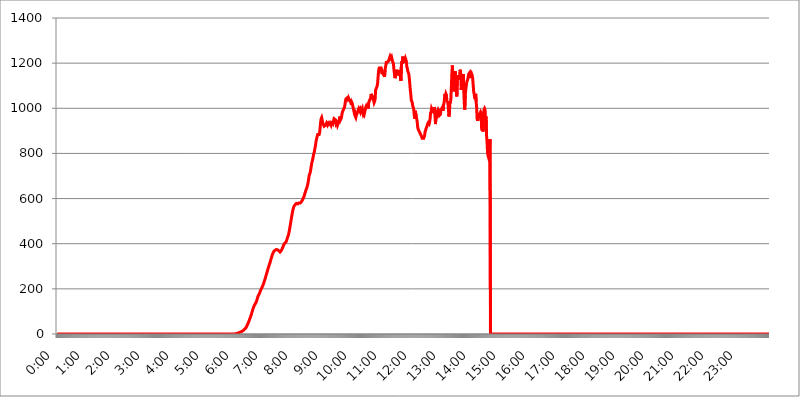
| Category | 2015.03.05. Intenzitás [W/m^2] |
|---|---|
| 0.0 | -0.256 |
| 0.0006944444444444445 | -0.256 |
| 0.001388888888888889 | -0.256 |
| 0.0020833333333333333 | -0.256 |
| 0.002777777777777778 | -0.256 |
| 0.003472222222222222 | -0.256 |
| 0.004166666666666667 | -0.256 |
| 0.004861111111111111 | -0.256 |
| 0.005555555555555556 | -0.256 |
| 0.0062499999999999995 | -0.256 |
| 0.006944444444444444 | -0.256 |
| 0.007638888888888889 | -0.256 |
| 0.008333333333333333 | -0.256 |
| 0.009027777777777779 | -0.256 |
| 0.009722222222222222 | -0.256 |
| 0.010416666666666666 | -0.256 |
| 0.011111111111111112 | -0.256 |
| 0.011805555555555555 | -0.256 |
| 0.012499999999999999 | -0.256 |
| 0.013194444444444444 | -0.256 |
| 0.013888888888888888 | -0.256 |
| 0.014583333333333332 | -0.256 |
| 0.015277777777777777 | -0.256 |
| 0.015972222222222224 | -0.256 |
| 0.016666666666666666 | -0.256 |
| 0.017361111111111112 | -0.256 |
| 0.018055555555555557 | -0.256 |
| 0.01875 | -0.256 |
| 0.019444444444444445 | -0.256 |
| 0.02013888888888889 | -0.256 |
| 0.020833333333333332 | -0.256 |
| 0.02152777777777778 | -0.256 |
| 0.022222222222222223 | -0.256 |
| 0.02291666666666667 | -0.256 |
| 0.02361111111111111 | -0.256 |
| 0.024305555555555556 | -0.256 |
| 0.024999999999999998 | -0.256 |
| 0.025694444444444447 | -0.256 |
| 0.02638888888888889 | -0.256 |
| 0.027083333333333334 | -0.256 |
| 0.027777777777777776 | -0.256 |
| 0.02847222222222222 | -0.256 |
| 0.029166666666666664 | -0.256 |
| 0.029861111111111113 | -0.256 |
| 0.030555555555555555 | -0.256 |
| 0.03125 | -0.256 |
| 0.03194444444444445 | -0.256 |
| 0.03263888888888889 | -0.256 |
| 0.03333333333333333 | -0.256 |
| 0.034027777777777775 | -0.256 |
| 0.034722222222222224 | -0.256 |
| 0.035416666666666666 | -0.256 |
| 0.036111111111111115 | -0.256 |
| 0.03680555555555556 | -0.256 |
| 0.0375 | -0.256 |
| 0.03819444444444444 | -0.256 |
| 0.03888888888888889 | -0.256 |
| 0.03958333333333333 | -0.256 |
| 0.04027777777777778 | -0.256 |
| 0.04097222222222222 | -0.256 |
| 0.041666666666666664 | -0.256 |
| 0.042361111111111106 | -0.256 |
| 0.04305555555555556 | -0.256 |
| 0.043750000000000004 | -0.256 |
| 0.044444444444444446 | -0.256 |
| 0.04513888888888889 | -0.256 |
| 0.04583333333333334 | -0.256 |
| 0.04652777777777778 | -0.256 |
| 0.04722222222222222 | -0.256 |
| 0.04791666666666666 | -0.256 |
| 0.04861111111111111 | -0.256 |
| 0.049305555555555554 | -0.256 |
| 0.049999999999999996 | -0.256 |
| 0.05069444444444445 | -0.256 |
| 0.051388888888888894 | -0.256 |
| 0.052083333333333336 | -0.256 |
| 0.05277777777777778 | -0.256 |
| 0.05347222222222222 | -0.256 |
| 0.05416666666666667 | -0.256 |
| 0.05486111111111111 | -0.256 |
| 0.05555555555555555 | -0.256 |
| 0.05625 | -0.256 |
| 0.05694444444444444 | -0.256 |
| 0.057638888888888885 | -0.256 |
| 0.05833333333333333 | -0.256 |
| 0.05902777777777778 | -0.256 |
| 0.059722222222222225 | -0.256 |
| 0.06041666666666667 | -0.256 |
| 0.061111111111111116 | -0.256 |
| 0.06180555555555556 | -0.256 |
| 0.0625 | -0.256 |
| 0.06319444444444444 | -0.256 |
| 0.06388888888888888 | -0.256 |
| 0.06458333333333334 | -0.256 |
| 0.06527777777777778 | -0.256 |
| 0.06597222222222222 | -0.256 |
| 0.06666666666666667 | -0.256 |
| 0.06736111111111111 | -0.256 |
| 0.06805555555555555 | -0.256 |
| 0.06874999999999999 | -0.256 |
| 0.06944444444444443 | -0.256 |
| 0.07013888888888889 | -0.256 |
| 0.07083333333333333 | -0.256 |
| 0.07152777777777779 | -0.256 |
| 0.07222222222222223 | -0.256 |
| 0.07291666666666667 | -0.256 |
| 0.07361111111111111 | -0.256 |
| 0.07430555555555556 | -0.256 |
| 0.075 | -0.256 |
| 0.07569444444444444 | -0.256 |
| 0.0763888888888889 | -0.256 |
| 0.07708333333333334 | -0.256 |
| 0.07777777777777778 | -0.256 |
| 0.07847222222222222 | -0.256 |
| 0.07916666666666666 | -0.256 |
| 0.0798611111111111 | -0.256 |
| 0.08055555555555556 | -0.256 |
| 0.08125 | -0.256 |
| 0.08194444444444444 | -0.256 |
| 0.08263888888888889 | -0.256 |
| 0.08333333333333333 | -0.256 |
| 0.08402777777777777 | -0.256 |
| 0.08472222222222221 | -0.256 |
| 0.08541666666666665 | -0.256 |
| 0.08611111111111112 | -0.256 |
| 0.08680555555555557 | -0.256 |
| 0.08750000000000001 | -0.256 |
| 0.08819444444444445 | -0.256 |
| 0.08888888888888889 | -0.256 |
| 0.08958333333333333 | -0.256 |
| 0.09027777777777778 | -0.256 |
| 0.09097222222222222 | -0.256 |
| 0.09166666666666667 | -0.256 |
| 0.09236111111111112 | -0.256 |
| 0.09305555555555556 | -0.256 |
| 0.09375 | -0.256 |
| 0.09444444444444444 | -0.256 |
| 0.09513888888888888 | -0.256 |
| 0.09583333333333333 | -0.256 |
| 0.09652777777777777 | -0.256 |
| 0.09722222222222222 | -0.256 |
| 0.09791666666666667 | -0.256 |
| 0.09861111111111111 | -0.256 |
| 0.09930555555555555 | -0.256 |
| 0.09999999999999999 | -0.256 |
| 0.10069444444444443 | -0.256 |
| 0.1013888888888889 | -0.256 |
| 0.10208333333333335 | -0.256 |
| 0.10277777777777779 | -0.256 |
| 0.10347222222222223 | -0.256 |
| 0.10416666666666667 | -0.256 |
| 0.10486111111111111 | -0.256 |
| 0.10555555555555556 | -0.256 |
| 0.10625 | -0.256 |
| 0.10694444444444444 | -0.256 |
| 0.1076388888888889 | -0.256 |
| 0.10833333333333334 | -0.256 |
| 0.10902777777777778 | -0.256 |
| 0.10972222222222222 | -0.256 |
| 0.1111111111111111 | -0.256 |
| 0.11180555555555556 | -0.256 |
| 0.11180555555555556 | -0.256 |
| 0.1125 | -0.256 |
| 0.11319444444444444 | -0.256 |
| 0.11388888888888889 | -0.256 |
| 0.11458333333333333 | -0.256 |
| 0.11527777777777777 | -0.256 |
| 0.11597222222222221 | -0.256 |
| 0.11666666666666665 | -0.256 |
| 0.1173611111111111 | -0.256 |
| 0.11805555555555557 | -0.256 |
| 0.11944444444444445 | -0.256 |
| 0.12013888888888889 | -0.256 |
| 0.12083333333333333 | -0.256 |
| 0.12152777777777778 | -0.256 |
| 0.12222222222222223 | -0.256 |
| 0.12291666666666667 | -0.256 |
| 0.12291666666666667 | -0.256 |
| 0.12361111111111112 | -0.256 |
| 0.12430555555555556 | -0.256 |
| 0.125 | -0.256 |
| 0.12569444444444444 | -0.256 |
| 0.12638888888888888 | -0.256 |
| 0.12708333333333333 | -0.256 |
| 0.16875 | -0.256 |
| 0.12847222222222224 | -0.256 |
| 0.12916666666666668 | -0.256 |
| 0.12986111111111112 | -0.256 |
| 0.13055555555555556 | -0.256 |
| 0.13125 | -0.256 |
| 0.13194444444444445 | -0.256 |
| 0.1326388888888889 | -0.256 |
| 0.13333333333333333 | -0.256 |
| 0.13402777777777777 | -0.256 |
| 0.13402777777777777 | -0.256 |
| 0.13472222222222222 | -0.256 |
| 0.13541666666666666 | -0.256 |
| 0.1361111111111111 | -0.256 |
| 0.13749999999999998 | -0.256 |
| 0.13819444444444443 | -0.256 |
| 0.1388888888888889 | -0.256 |
| 0.13958333333333334 | -0.256 |
| 0.14027777777777778 | -0.256 |
| 0.14097222222222222 | -0.256 |
| 0.14166666666666666 | -0.256 |
| 0.1423611111111111 | -0.256 |
| 0.14305555555555557 | -0.256 |
| 0.14375000000000002 | -0.256 |
| 0.14444444444444446 | -0.256 |
| 0.1451388888888889 | -0.256 |
| 0.1451388888888889 | -0.256 |
| 0.14652777777777778 | -0.256 |
| 0.14722222222222223 | -0.256 |
| 0.14791666666666667 | -0.256 |
| 0.1486111111111111 | -0.256 |
| 0.14930555555555555 | -0.256 |
| 0.15 | -0.256 |
| 0.15069444444444444 | -0.256 |
| 0.15138888888888888 | -0.256 |
| 0.15208333333333332 | -0.256 |
| 0.15277777777777776 | -0.256 |
| 0.15347222222222223 | -0.256 |
| 0.15416666666666667 | -0.256 |
| 0.15486111111111112 | -0.256 |
| 0.15555555555555556 | -0.256 |
| 0.15625 | -0.256 |
| 0.15694444444444444 | -0.256 |
| 0.15763888888888888 | -0.256 |
| 0.15833333333333333 | -0.256 |
| 0.15902777777777777 | -0.256 |
| 0.15972222222222224 | -0.256 |
| 0.16041666666666668 | -0.256 |
| 0.16111111111111112 | -0.256 |
| 0.16180555555555556 | -0.256 |
| 0.1625 | -0.256 |
| 0.16319444444444445 | -0.256 |
| 0.1638888888888889 | -0.256 |
| 0.16458333333333333 | -0.256 |
| 0.16527777777777777 | -0.256 |
| 0.16597222222222222 | -0.256 |
| 0.16666666666666666 | -0.256 |
| 0.1673611111111111 | -0.256 |
| 0.16805555555555554 | -0.256 |
| 0.16874999999999998 | -0.256 |
| 0.16944444444444443 | -0.256 |
| 0.17013888888888887 | -0.256 |
| 0.1708333333333333 | -0.256 |
| 0.17152777777777775 | -0.256 |
| 0.17222222222222225 | -0.256 |
| 0.1729166666666667 | -0.256 |
| 0.17361111111111113 | -0.256 |
| 0.17430555555555557 | -0.256 |
| 0.17500000000000002 | -0.256 |
| 0.17569444444444446 | -0.256 |
| 0.1763888888888889 | -0.256 |
| 0.17708333333333334 | -0.256 |
| 0.17777777777777778 | -0.256 |
| 0.17847222222222223 | -0.256 |
| 0.17916666666666667 | -0.256 |
| 0.1798611111111111 | -0.256 |
| 0.18055555555555555 | -0.256 |
| 0.18125 | -0.256 |
| 0.18194444444444444 | -0.256 |
| 0.1826388888888889 | -0.256 |
| 0.18333333333333335 | -0.256 |
| 0.1840277777777778 | -0.256 |
| 0.18472222222222223 | -0.256 |
| 0.18541666666666667 | -0.256 |
| 0.18611111111111112 | -0.256 |
| 0.18680555555555556 | -0.256 |
| 0.1875 | -0.256 |
| 0.18819444444444444 | -0.256 |
| 0.18888888888888888 | -0.256 |
| 0.18958333333333333 | -0.256 |
| 0.19027777777777777 | -0.256 |
| 0.1909722222222222 | -0.256 |
| 0.19166666666666665 | -0.256 |
| 0.19236111111111112 | -0.256 |
| 0.19305555555555554 | -0.256 |
| 0.19375 | -0.256 |
| 0.19444444444444445 | -0.256 |
| 0.1951388888888889 | -0.256 |
| 0.19583333333333333 | -0.256 |
| 0.19652777777777777 | -0.256 |
| 0.19722222222222222 | -0.256 |
| 0.19791666666666666 | -0.256 |
| 0.1986111111111111 | -0.256 |
| 0.19930555555555554 | -0.256 |
| 0.19999999999999998 | -0.256 |
| 0.20069444444444443 | -0.256 |
| 0.20138888888888887 | -0.256 |
| 0.2020833333333333 | -0.256 |
| 0.2027777777777778 | -0.256 |
| 0.2034722222222222 | -0.256 |
| 0.2041666666666667 | -0.256 |
| 0.20486111111111113 | -0.256 |
| 0.20555555555555557 | -0.256 |
| 0.20625000000000002 | -0.256 |
| 0.20694444444444446 | -0.256 |
| 0.2076388888888889 | -0.256 |
| 0.20833333333333334 | -0.256 |
| 0.20902777777777778 | -0.256 |
| 0.20972222222222223 | -0.256 |
| 0.21041666666666667 | -0.256 |
| 0.2111111111111111 | -0.256 |
| 0.21180555555555555 | -0.256 |
| 0.2125 | -0.256 |
| 0.21319444444444444 | -0.256 |
| 0.2138888888888889 | -0.256 |
| 0.21458333333333335 | -0.256 |
| 0.2152777777777778 | -0.256 |
| 0.21597222222222223 | -0.256 |
| 0.21666666666666667 | -0.256 |
| 0.21736111111111112 | -0.256 |
| 0.21805555555555556 | -0.256 |
| 0.21875 | -0.256 |
| 0.21944444444444444 | -0.256 |
| 0.22013888888888888 | -0.256 |
| 0.22083333333333333 | -0.256 |
| 0.22152777777777777 | -0.256 |
| 0.2222222222222222 | -0.256 |
| 0.22291666666666665 | -0.256 |
| 0.2236111111111111 | -0.256 |
| 0.22430555555555556 | -0.256 |
| 0.225 | -0.256 |
| 0.22569444444444445 | -0.256 |
| 0.2263888888888889 | -0.256 |
| 0.22708333333333333 | -0.256 |
| 0.22777777777777777 | -0.256 |
| 0.22847222222222222 | -0.256 |
| 0.22916666666666666 | -0.256 |
| 0.2298611111111111 | -0.256 |
| 0.23055555555555554 | -0.256 |
| 0.23124999999999998 | -0.256 |
| 0.23194444444444443 | -0.256 |
| 0.23263888888888887 | -0.256 |
| 0.2333333333333333 | -0.256 |
| 0.2340277777777778 | -0.256 |
| 0.2347222222222222 | -0.256 |
| 0.2354166666666667 | -0.256 |
| 0.23611111111111113 | -0.256 |
| 0.23680555555555557 | -0.256 |
| 0.23750000000000002 | -0.256 |
| 0.23819444444444446 | -0.256 |
| 0.2388888888888889 | -0.256 |
| 0.23958333333333334 | -0.256 |
| 0.24027777777777778 | -0.256 |
| 0.24097222222222223 | -0.256 |
| 0.24166666666666667 | -0.256 |
| 0.2423611111111111 | -0.256 |
| 0.24305555555555555 | -0.256 |
| 0.24375 | -0.256 |
| 0.24444444444444446 | -0.256 |
| 0.24513888888888888 | -0.256 |
| 0.24583333333333335 | -0.256 |
| 0.2465277777777778 | -0.256 |
| 0.24722222222222223 | -0.256 |
| 0.24791666666666667 | -0.256 |
| 0.24861111111111112 | -0.256 |
| 0.24930555555555556 | 1.09 |
| 0.25 | 1.09 |
| 0.25069444444444444 | 1.09 |
| 0.2513888888888889 | 2.439 |
| 0.2520833333333333 | 2.439 |
| 0.25277777777777777 | 3.791 |
| 0.2534722222222222 | 3.791 |
| 0.25416666666666665 | 5.146 |
| 0.2548611111111111 | 5.146 |
| 0.2555555555555556 | 6.503 |
| 0.25625000000000003 | 7.862 |
| 0.2569444444444445 | 9.225 |
| 0.2576388888888889 | 9.225 |
| 0.25833333333333336 | 10.589 |
| 0.2590277777777778 | 11.956 |
| 0.25972222222222224 | 13.325 |
| 0.2604166666666667 | 14.696 |
| 0.2611111111111111 | 16.069 |
| 0.26180555555555557 | 18.822 |
| 0.2625 | 20.201 |
| 0.26319444444444445 | 21.582 |
| 0.2638888888888889 | 22.965 |
| 0.26458333333333334 | 27.124 |
| 0.2652777777777778 | 31.297 |
| 0.2659722222222222 | 35.483 |
| 0.26666666666666666 | 39.68 |
| 0.2673611111111111 | 45.29 |
| 0.26805555555555555 | 50.914 |
| 0.26875 | 56.548 |
| 0.26944444444444443 | 62.189 |
| 0.2701388888888889 | 67.835 |
| 0.2708333333333333 | 73.481 |
| 0.27152777777777776 | 80.536 |
| 0.2722222222222222 | 86.175 |
| 0.27291666666666664 | 94.617 |
| 0.2736111111111111 | 101.634 |
| 0.2743055555555555 | 108.629 |
| 0.27499999999999997 | 115.598 |
| 0.27569444444444446 | 121.152 |
| 0.27638888888888885 | 125.304 |
| 0.27708333333333335 | 130.821 |
| 0.2777777777777778 | 133.57 |
| 0.27847222222222223 | 137.683 |
| 0.2791666666666667 | 141.782 |
| 0.2798611111111111 | 148.579 |
| 0.28055555555555556 | 156.678 |
| 0.28125 | 163.378 |
| 0.28194444444444444 | 170.029 |
| 0.2826388888888889 | 173.996 |
| 0.2833333333333333 | 177.946 |
| 0.28402777777777777 | 183.184 |
| 0.2847222222222222 | 189.685 |
| 0.28541666666666665 | 194.849 |
| 0.28611111111111115 | 198.701 |
| 0.28680555555555554 | 203.807 |
| 0.28750000000000003 | 208.881 |
| 0.2881944444444445 | 213.921 |
| 0.2888888888888889 | 218.93 |
| 0.28958333333333336 | 225.146 |
| 0.2902777777777778 | 232.54 |
| 0.29097222222222224 | 238.651 |
| 0.2916666666666667 | 245.925 |
| 0.2923611111111111 | 253.137 |
| 0.29305555555555557 | 261.48 |
| 0.29375 | 268.576 |
| 0.29444444444444445 | 275.626 |
| 0.2951388888888889 | 283.803 |
| 0.29583333333333334 | 290.777 |
| 0.2965277777777778 | 297.728 |
| 0.2972222222222222 | 304.664 |
| 0.29791666666666666 | 311.594 |
| 0.2986111111111111 | 318.527 |
| 0.29930555555555555 | 326.633 |
| 0.3 | 333.608 |
| 0.30069444444444443 | 340.62 |
| 0.3013888888888889 | 348.865 |
| 0.3020833333333333 | 354.805 |
| 0.30277777777777776 | 359.595 |
| 0.3034722222222222 | 364.422 |
| 0.30416666666666664 | 366.851 |
| 0.3048611111111111 | 369.291 |
| 0.3055555555555555 | 371.742 |
| 0.30624999999999997 | 372.972 |
| 0.3069444444444444 | 374.206 |
| 0.3076388888888889 | 374.206 |
| 0.30833333333333335 | 374.206 |
| 0.3090277777777778 | 372.972 |
| 0.30972222222222223 | 371.742 |
| 0.3104166666666667 | 370.515 |
| 0.3111111111111111 | 368.07 |
| 0.31180555555555556 | 364.422 |
| 0.3125 | 363.212 |
| 0.31319444444444444 | 364.422 |
| 0.3138888888888889 | 368.07 |
| 0.3145833333333333 | 371.742 |
| 0.31527777777777777 | 376.682 |
| 0.3159722222222222 | 381.674 |
| 0.31666666666666665 | 386.723 |
| 0.31736111111111115 | 393.122 |
| 0.31805555555555554 | 397.012 |
| 0.31875000000000003 | 400.943 |
| 0.3194444444444445 | 402.262 |
| 0.3201388888888889 | 404.916 |
| 0.32083333333333336 | 407.589 |
| 0.3215277777777778 | 412.998 |
| 0.32222222222222224 | 419.883 |
| 0.3229166666666667 | 426.916 |
| 0.3236111111111111 | 432.656 |
| 0.32430555555555557 | 439.982 |
| 0.325 | 449.011 |
| 0.32569444444444445 | 461.486 |
| 0.3263888888888889 | 474.507 |
| 0.32708333333333334 | 486.389 |
| 0.3277777777777778 | 500.575 |
| 0.3284722222222222 | 513.561 |
| 0.32916666666666666 | 527.122 |
| 0.3298611111111111 | 539.234 |
| 0.33055555555555555 | 549.691 |
| 0.33125 | 558.305 |
| 0.33194444444444443 | 564.917 |
| 0.3326388888888889 | 569.398 |
| 0.3333333333333333 | 571.661 |
| 0.3340277777777778 | 573.939 |
| 0.3347222222222222 | 576.233 |
| 0.3354166666666667 | 578.542 |
| 0.3361111111111111 | 580.866 |
| 0.3368055555555556 | 580.866 |
| 0.33749999999999997 | 576.233 |
| 0.33819444444444446 | 576.233 |
| 0.33888888888888885 | 580.866 |
| 0.33958333333333335 | 578.542 |
| 0.34027777777777773 | 578.542 |
| 0.34097222222222223 | 580.866 |
| 0.3416666666666666 | 580.866 |
| 0.3423611111111111 | 585.562 |
| 0.3430555555555555 | 587.934 |
| 0.34375 | 592.725 |
| 0.3444444444444445 | 597.582 |
| 0.3451388888888889 | 602.505 |
| 0.3458333333333334 | 607.495 |
| 0.34652777777777777 | 612.554 |
| 0.34722222222222227 | 622.881 |
| 0.34791666666666665 | 628.152 |
| 0.34861111111111115 | 636.194 |
| 0.34930555555555554 | 641.649 |
| 0.35000000000000003 | 647.179 |
| 0.3506944444444444 | 655.618 |
| 0.3513888888888889 | 664.234 |
| 0.3520833333333333 | 676.003 |
| 0.3527777777777778 | 691.18 |
| 0.3534722222222222 | 703.704 |
| 0.3541666666666667 | 710.098 |
| 0.3548611111111111 | 716.58 |
| 0.35555555555555557 | 729.817 |
| 0.35625 | 743.425 |
| 0.35694444444444445 | 757.414 |
| 0.3576388888888889 | 764.555 |
| 0.35833333333333334 | 775.451 |
| 0.3590277777777778 | 786.575 |
| 0.3597222222222222 | 797.931 |
| 0.36041666666666666 | 805.632 |
| 0.3611111111111111 | 817.382 |
| 0.36180555555555555 | 829.377 |
| 0.3625 | 841.619 |
| 0.36319444444444443 | 858.335 |
| 0.3638888888888889 | 866.865 |
| 0.3645833333333333 | 875.511 |
| 0.3652777777777778 | 884.274 |
| 0.3659722222222222 | 884.274 |
| 0.3666666666666667 | 884.274 |
| 0.3673611111111111 | 884.274 |
| 0.3680555555555556 | 893.157 |
| 0.36874999999999997 | 915.893 |
| 0.36944444444444446 | 939.404 |
| 0.37013888888888885 | 953.892 |
| 0.37083333333333335 | 958.785 |
| 0.37152777777777773 | 958.785 |
| 0.37222222222222223 | 939.404 |
| 0.3729166666666666 | 929.905 |
| 0.3736111111111111 | 929.905 |
| 0.3743055555555555 | 920.533 |
| 0.375 | 920.533 |
| 0.3756944444444445 | 920.533 |
| 0.3763888888888889 | 925.203 |
| 0.3770833333333334 | 925.203 |
| 0.37777777777777777 | 934.639 |
| 0.37847222222222227 | 929.905 |
| 0.37916666666666665 | 925.203 |
| 0.37986111111111115 | 925.203 |
| 0.38055555555555554 | 934.639 |
| 0.38125000000000003 | 934.639 |
| 0.3819444444444444 | 929.905 |
| 0.3826388888888889 | 934.639 |
| 0.3833333333333333 | 929.905 |
| 0.3840277777777778 | 925.203 |
| 0.3847222222222222 | 934.639 |
| 0.3854166666666667 | 934.639 |
| 0.3861111111111111 | 939.404 |
| 0.38680555555555557 | 934.639 |
| 0.3875 | 944.201 |
| 0.38819444444444445 | 953.892 |
| 0.3888888888888889 | 953.892 |
| 0.38958333333333334 | 953.892 |
| 0.3902777777777778 | 949.03 |
| 0.3909722222222222 | 934.639 |
| 0.39166666666666666 | 939.404 |
| 0.3923611111111111 | 934.639 |
| 0.39305555555555555 | 925.203 |
| 0.39375 | 925.203 |
| 0.39444444444444443 | 925.203 |
| 0.3951388888888889 | 944.201 |
| 0.3958333333333333 | 953.892 |
| 0.3965277777777778 | 963.712 |
| 0.3972222222222222 | 949.03 |
| 0.3979166666666667 | 953.892 |
| 0.3986111111111111 | 958.785 |
| 0.3993055555555556 | 973.663 |
| 0.39999999999999997 | 983.747 |
| 0.40069444444444446 | 988.839 |
| 0.40138888888888885 | 993.965 |
| 0.40208333333333335 | 999.125 |
| 0.40277777777777773 | 1004.318 |
| 0.40347222222222223 | 1014.809 |
| 0.4041666666666666 | 1030.804 |
| 0.4048611111111111 | 1041.644 |
| 0.4055555555555555 | 1041.644 |
| 0.40625 | 1041.644 |
| 0.4069444444444445 | 1047.117 |
| 0.4076388888888889 | 1041.644 |
| 0.4083333333333334 | 1047.117 |
| 0.40902777777777777 | 1041.644 |
| 0.40972222222222227 | 1041.644 |
| 0.41041666666666665 | 1041.644 |
| 0.41111111111111115 | 1030.804 |
| 0.41180555555555554 | 1025.437 |
| 0.41250000000000003 | 1014.809 |
| 0.4131944444444444 | 1025.437 |
| 0.4138888888888889 | 1020.106 |
| 0.4145833333333333 | 1009.546 |
| 0.4152777777777778 | 999.125 |
| 0.4159722222222222 | 988.839 |
| 0.4166666666666667 | 993.965 |
| 0.4173611111111111 | 973.663 |
| 0.41805555555555557 | 963.712 |
| 0.41875 | 958.785 |
| 0.41944444444444445 | 968.671 |
| 0.4201388888888889 | 973.663 |
| 0.42083333333333334 | 973.663 |
| 0.4215277777777778 | 973.663 |
| 0.4222222222222222 | 993.965 |
| 0.42291666666666666 | 999.125 |
| 0.4236111111111111 | 999.125 |
| 0.42430555555555555 | 988.839 |
| 0.425 | 983.747 |
| 0.42569444444444443 | 993.965 |
| 0.4263888888888889 | 988.839 |
| 0.4270833333333333 | 988.839 |
| 0.4277777777777778 | 999.125 |
| 0.4284722222222222 | 983.747 |
| 0.4291666666666667 | 973.663 |
| 0.4298611111111111 | 978.688 |
| 0.4305555555555556 | 973.663 |
| 0.43124999999999997 | 973.663 |
| 0.43194444444444446 | 993.965 |
| 0.43263888888888885 | 1004.318 |
| 0.43333333333333335 | 1009.546 |
| 0.43402777777777773 | 1004.318 |
| 0.43472222222222223 | 1004.318 |
| 0.4354166666666666 | 1009.546 |
| 0.4361111111111111 | 999.125 |
| 0.4368055555555555 | 1025.437 |
| 0.4375 | 1025.437 |
| 0.4381944444444445 | 1025.437 |
| 0.4388888888888889 | 1041.644 |
| 0.4395833333333334 | 1047.117 |
| 0.44027777777777777 | 1063.751 |
| 0.44097222222222227 | 1063.751 |
| 0.44166666666666665 | 1052.625 |
| 0.44236111111111115 | 1041.644 |
| 0.44305555555555554 | 1041.644 |
| 0.44375000000000003 | 1036.206 |
| 0.4444444444444444 | 1025.437 |
| 0.4451388888888889 | 1030.804 |
| 0.4458333333333333 | 1041.644 |
| 0.4465277777777778 | 1080.711 |
| 0.4472222222222222 | 1086.439 |
| 0.4479166666666667 | 1092.203 |
| 0.4486111111111111 | 1098.004 |
| 0.44930555555555557 | 1109.72 |
| 0.45 | 1139.675 |
| 0.45069444444444445 | 1164.337 |
| 0.4513888888888889 | 1176.905 |
| 0.45208333333333334 | 1183.249 |
| 0.4527777777777778 | 1170.601 |
| 0.4534722222222222 | 1183.249 |
| 0.45416666666666666 | 1176.905 |
| 0.4548611111111111 | 1164.337 |
| 0.45555555555555555 | 1151.928 |
| 0.45625 | 1158.113 |
| 0.45694444444444443 | 1151.928 |
| 0.4576388888888889 | 1151.928 |
| 0.4583333333333333 | 1145.782 |
| 0.4590277777777778 | 1139.675 |
| 0.4597222222222222 | 1170.601 |
| 0.4604166666666667 | 1183.249 |
| 0.4611111111111111 | 1196.058 |
| 0.4618055555555556 | 1209.029 |
| 0.46249999999999997 | 1202.523 |
| 0.46319444444444446 | 1202.523 |
| 0.46388888888888885 | 1202.523 |
| 0.46458333333333335 | 1209.029 |
| 0.46527777777777773 | 1215.576 |
| 0.46597222222222223 | 1222.164 |
| 0.4666666666666666 | 1228.794 |
| 0.4673611111111111 | 1222.164 |
| 0.4680555555555555 | 1222.164 |
| 0.46875 | 1228.794 |
| 0.4694444444444445 | 1228.794 |
| 0.4701388888888889 | 1209.029 |
| 0.4708333333333334 | 1202.523 |
| 0.47152777777777777 | 1196.058 |
| 0.47222222222222227 | 1170.601 |
| 0.47291666666666665 | 1151.928 |
| 0.47361111111111115 | 1133.607 |
| 0.47430555555555554 | 1139.675 |
| 0.47500000000000003 | 1158.113 |
| 0.4756944444444444 | 1170.601 |
| 0.4763888888888889 | 1158.113 |
| 0.4770833333333333 | 1145.782 |
| 0.4777777777777778 | 1164.337 |
| 0.4784722222222222 | 1164.337 |
| 0.4791666666666667 | 1164.337 |
| 0.4798611111111111 | 1164.337 |
| 0.48055555555555557 | 1151.928 |
| 0.48125 | 1139.675 |
| 0.48194444444444445 | 1121.587 |
| 0.4826388888888889 | 1183.249 |
| 0.48333333333333334 | 1209.029 |
| 0.4840277777777778 | 1196.058 |
| 0.4847222222222222 | 1228.794 |
| 0.48541666666666666 | 1215.576 |
| 0.4861111111111111 | 1202.523 |
| 0.48680555555555555 | 1202.523 |
| 0.4875 | 1202.523 |
| 0.48819444444444443 | 1222.164 |
| 0.4888888888888889 | 1222.164 |
| 0.4895833333333333 | 1209.029 |
| 0.4902777777777778 | 1183.249 |
| 0.4909722222222222 | 1176.905 |
| 0.4916666666666667 | 1164.337 |
| 0.4923611111111111 | 1164.337 |
| 0.4930555555555556 | 1151.928 |
| 0.49374999999999997 | 1133.607 |
| 0.49444444444444446 | 1109.72 |
| 0.49513888888888885 | 1080.711 |
| 0.49583333333333335 | 1063.751 |
| 0.49652777777777773 | 1036.206 |
| 0.49722222222222223 | 1030.804 |
| 0.4979166666666666 | 1025.437 |
| 0.4986111111111111 | 1009.546 |
| 0.4993055555555555 | 1004.318 |
| 0.5 | 993.965 |
| 0.5006944444444444 | 968.671 |
| 0.5013888888888889 | 953.892 |
| 0.5020833333333333 | 988.839 |
| 0.5027777777777778 | 988.839 |
| 0.5034722222222222 | 963.712 |
| 0.5041666666666667 | 953.892 |
| 0.5048611111111111 | 939.404 |
| 0.5055555555555555 | 915.893 |
| 0.50625 | 906.707 |
| 0.5069444444444444 | 902.16 |
| 0.5076388888888889 | 897.643 |
| 0.5083333333333333 | 897.643 |
| 0.5090277777777777 | 888.701 |
| 0.5097222222222222 | 884.274 |
| 0.5104166666666666 | 879.878 |
| 0.5111111111111112 | 875.511 |
| 0.5118055555555555 | 866.865 |
| 0.5125000000000001 | 866.865 |
| 0.5131944444444444 | 862.585 |
| 0.513888888888889 | 866.865 |
| 0.5145833333333333 | 862.585 |
| 0.5152777777777778 | 879.878 |
| 0.5159722222222222 | 897.643 |
| 0.5166666666666667 | 902.16 |
| 0.517361111111111 | 911.285 |
| 0.5180555555555556 | 915.893 |
| 0.5187499999999999 | 915.893 |
| 0.5194444444444445 | 929.905 |
| 0.5201388888888888 | 934.639 |
| 0.5208333333333334 | 934.639 |
| 0.5215277777777778 | 929.905 |
| 0.5222222222222223 | 939.404 |
| 0.5229166666666667 | 953.892 |
| 0.5236111111111111 | 978.688 |
| 0.5243055555555556 | 983.747 |
| 0.525 | 999.125 |
| 0.5256944444444445 | 999.125 |
| 0.5263888888888889 | 988.839 |
| 0.5270833333333333 | 988.839 |
| 0.5277777777777778 | 983.747 |
| 0.5284722222222222 | 1004.318 |
| 0.5291666666666667 | 999.125 |
| 0.5298611111111111 | 999.125 |
| 0.5305555555555556 | 929.905 |
| 0.53125 | 988.839 |
| 0.5319444444444444 | 978.688 |
| 0.5326388888888889 | 973.663 |
| 0.5333333333333333 | 988.839 |
| 0.5340277777777778 | 993.965 |
| 0.5347222222222222 | 988.839 |
| 0.5354166666666667 | 988.839 |
| 0.5361111111111111 | 968.671 |
| 0.5368055555555555 | 968.671 |
| 0.5375 | 973.663 |
| 0.5381944444444444 | 993.965 |
| 0.5388888888888889 | 993.965 |
| 0.5395833333333333 | 993.965 |
| 0.5402777777777777 | 1004.318 |
| 0.5409722222222222 | 988.839 |
| 0.5416666666666666 | 1014.809 |
| 0.5423611111111112 | 1020.106 |
| 0.5430555555555555 | 1041.644 |
| 0.5437500000000001 | 1063.751 |
| 0.5444444444444444 | 1052.625 |
| 0.545138888888889 | 1063.751 |
| 0.5458333333333333 | 1058.17 |
| 0.5465277777777778 | 1030.804 |
| 0.5472222222222222 | 1030.804 |
| 0.5479166666666667 | 1025.437 |
| 0.548611111111111 | 999.125 |
| 0.5493055555555556 | 963.712 |
| 0.5499999999999999 | 978.688 |
| 0.5506944444444445 | 1020.106 |
| 0.5513888888888888 | 1025.437 |
| 0.5520833333333334 | 1041.644 |
| 0.5527777777777778 | 1041.644 |
| 0.5534722222222223 | 1151.928 |
| 0.5541666666666667 | 1189.633 |
| 0.5548611111111111 | 1109.72 |
| 0.5555555555555556 | 1164.337 |
| 0.55625 | 1075.021 |
| 0.5569444444444445 | 1092.203 |
| 0.5576388888888889 | 1158.113 |
| 0.5583333333333333 | 1164.337 |
| 0.5590277777777778 | 1127.578 |
| 0.5597222222222222 | 1080.711 |
| 0.5604166666666667 | 1052.625 |
| 0.5611111111111111 | 1127.578 |
| 0.5618055555555556 | 1139.675 |
| 0.5625 | 1145.782 |
| 0.5631944444444444 | 1127.578 |
| 0.5638888888888889 | 1145.782 |
| 0.5645833333333333 | 1139.675 |
| 0.5652777777777778 | 1170.601 |
| 0.5659722222222222 | 1139.675 |
| 0.5666666666666667 | 1080.711 |
| 0.5673611111111111 | 1139.675 |
| 0.5680555555555555 | 1115.634 |
| 0.56875 | 1145.782 |
| 0.5694444444444444 | 1151.928 |
| 0.5701388888888889 | 1080.711 |
| 0.5708333333333333 | 1025.437 |
| 0.5715277777777777 | 993.965 |
| 0.5722222222222222 | 1058.17 |
| 0.5729166666666666 | 1080.711 |
| 0.5736111111111112 | 1098.004 |
| 0.5743055555555555 | 1115.634 |
| 0.5750000000000001 | 1121.587 |
| 0.5756944444444444 | 1127.578 |
| 0.576388888888889 | 1139.675 |
| 0.5770833333333333 | 1151.928 |
| 0.5777777777777778 | 1151.928 |
| 0.5784722222222222 | 1158.113 |
| 0.5791666666666667 | 1158.113 |
| 0.579861111111111 | 1133.607 |
| 0.5805555555555556 | 1145.782 |
| 0.5812499999999999 | 1151.928 |
| 0.5819444444444445 | 1145.782 |
| 0.5826388888888888 | 1133.607 |
| 0.5833333333333334 | 1103.843 |
| 0.5840277777777778 | 1075.021 |
| 0.5847222222222223 | 1063.751 |
| 0.5854166666666667 | 1047.117 |
| 0.5861111111111111 | 1041.644 |
| 0.5868055555555556 | 1063.751 |
| 0.5875 | 1030.804 |
| 0.5881944444444445 | 1004.318 |
| 0.5888888888888889 | 953.892 |
| 0.5895833333333333 | 944.201 |
| 0.5902777777777778 | 953.892 |
| 0.5909722222222222 | 953.892 |
| 0.5916666666666667 | 973.663 |
| 0.5923611111111111 | 973.663 |
| 0.5930555555555556 | 978.688 |
| 0.59375 | 983.747 |
| 0.5944444444444444 | 978.688 |
| 0.5951388888888889 | 915.893 |
| 0.5958333333333333 | 902.16 |
| 0.5965277777777778 | 920.533 |
| 0.5972222222222222 | 897.643 |
| 0.5979166666666667 | 978.688 |
| 0.5986111111111111 | 993.965 |
| 0.5993055555555555 | 999.125 |
| 0.6 | 993.965 |
| 0.6006944444444444 | 953.892 |
| 0.6013888888888889 | 963.712 |
| 0.6020833333333333 | 879.878 |
| 0.6027777777777777 | 854.113 |
| 0.6034722222222222 | 805.632 |
| 0.6041666666666666 | 790.334 |
| 0.6048611111111112 | 782.842 |
| 0.6055555555555555 | 790.334 |
| 0.6062500000000001 | 817.382 |
| 0.6069444444444444 | 862.585 |
| 0.607638888888889 | -0.256 |
| 0.6083333333333333 | -0.256 |
| 0.6090277777777778 | -0.256 |
| 0.6097222222222222 | -0.256 |
| 0.6104166666666667 | -0.256 |
| 0.611111111111111 | -0.256 |
| 0.6118055555555556 | -0.256 |
| 0.6124999999999999 | -0.256 |
| 0.6131944444444445 | -0.256 |
| 0.6138888888888888 | -0.256 |
| 0.6145833333333334 | -0.256 |
| 0.6152777777777778 | -0.256 |
| 0.6159722222222223 | -0.256 |
| 0.6166666666666667 | -0.256 |
| 0.6173611111111111 | -0.256 |
| 0.6180555555555556 | -0.256 |
| 0.61875 | -0.256 |
| 0.6194444444444445 | -0.256 |
| 0.6201388888888889 | -0.256 |
| 0.6208333333333333 | -0.256 |
| 0.6215277777777778 | -0.256 |
| 0.6222222222222222 | -0.256 |
| 0.6229166666666667 | -0.256 |
| 0.6236111111111111 | -0.256 |
| 0.6243055555555556 | -0.256 |
| 0.625 | -0.256 |
| 0.6256944444444444 | -0.256 |
| 0.6263888888888889 | -0.256 |
| 0.6270833333333333 | -0.256 |
| 0.6277777777777778 | -0.256 |
| 0.6284722222222222 | -0.256 |
| 0.6291666666666667 | -0.256 |
| 0.6298611111111111 | -0.256 |
| 0.6305555555555555 | -0.256 |
| 0.63125 | -0.256 |
| 0.6319444444444444 | -0.256 |
| 0.6326388888888889 | -0.256 |
| 0.6333333333333333 | -0.256 |
| 0.6340277777777777 | -0.256 |
| 0.6347222222222222 | -0.256 |
| 0.6354166666666666 | -0.256 |
| 0.6361111111111112 | -0.256 |
| 0.6368055555555555 | -0.256 |
| 0.6375000000000001 | -0.256 |
| 0.6381944444444444 | -0.256 |
| 0.638888888888889 | -0.256 |
| 0.6395833333333333 | -0.256 |
| 0.6402777777777778 | -0.256 |
| 0.6409722222222222 | -0.256 |
| 0.6416666666666667 | -0.256 |
| 0.642361111111111 | -0.256 |
| 0.6430555555555556 | -0.256 |
| 0.6437499999999999 | -0.256 |
| 0.6444444444444445 | -0.256 |
| 0.6451388888888888 | -0.256 |
| 0.6458333333333334 | -0.256 |
| 0.6465277777777778 | -0.256 |
| 0.6472222222222223 | -0.256 |
| 0.6479166666666667 | -0.256 |
| 0.6486111111111111 | -0.256 |
| 0.6493055555555556 | -0.256 |
| 0.65 | -0.256 |
| 0.6506944444444445 | -0.256 |
| 0.6513888888888889 | -0.256 |
| 0.6520833333333333 | -0.256 |
| 0.6527777777777778 | -0.256 |
| 0.6534722222222222 | -0.256 |
| 0.6541666666666667 | -0.256 |
| 0.6548611111111111 | -0.256 |
| 0.6555555555555556 | -0.256 |
| 0.65625 | -0.256 |
| 0.6569444444444444 | -0.256 |
| 0.6576388888888889 | -0.256 |
| 0.6583333333333333 | -0.256 |
| 0.6590277777777778 | -0.256 |
| 0.6597222222222222 | -0.256 |
| 0.6604166666666667 | -0.256 |
| 0.6611111111111111 | -0.256 |
| 0.6618055555555555 | -0.256 |
| 0.6625 | -0.256 |
| 0.6631944444444444 | -0.256 |
| 0.6638888888888889 | -0.256 |
| 0.6645833333333333 | -0.256 |
| 0.6652777777777777 | -0.256 |
| 0.6659722222222222 | -0.256 |
| 0.6666666666666666 | -0.256 |
| 0.6673611111111111 | -0.256 |
| 0.6680555555555556 | -0.256 |
| 0.6687500000000001 | -0.256 |
| 0.6694444444444444 | -0.256 |
| 0.6701388888888888 | -0.256 |
| 0.6708333333333334 | -0.256 |
| 0.6715277777777778 | -0.256 |
| 0.6722222222222222 | -0.256 |
| 0.6729166666666666 | -0.256 |
| 0.6736111111111112 | -0.256 |
| 0.6743055555555556 | -0.256 |
| 0.6749999999999999 | -0.256 |
| 0.6756944444444444 | -0.256 |
| 0.6763888888888889 | -0.256 |
| 0.6770833333333334 | -0.256 |
| 0.6777777777777777 | -0.256 |
| 0.6784722222222223 | -0.256 |
| 0.6791666666666667 | -0.256 |
| 0.6798611111111111 | -0.256 |
| 0.6805555555555555 | -0.256 |
| 0.68125 | -0.256 |
| 0.6819444444444445 | -0.256 |
| 0.6826388888888889 | -0.256 |
| 0.6833333333333332 | -0.256 |
| 0.6840277777777778 | -0.256 |
| 0.6847222222222222 | -0.256 |
| 0.6854166666666667 | -0.256 |
| 0.686111111111111 | -0.256 |
| 0.6868055555555556 | -0.256 |
| 0.6875 | -0.256 |
| 0.6881944444444444 | -0.256 |
| 0.688888888888889 | -0.256 |
| 0.6895833333333333 | -0.256 |
| 0.6902777777777778 | -0.256 |
| 0.6909722222222222 | -0.256 |
| 0.6916666666666668 | -0.256 |
| 0.6923611111111111 | -0.256 |
| 0.6930555555555555 | -0.256 |
| 0.69375 | -0.256 |
| 0.6944444444444445 | -0.256 |
| 0.6951388888888889 | -0.256 |
| 0.6958333333333333 | -0.256 |
| 0.6965277777777777 | -0.256 |
| 0.6972222222222223 | -0.256 |
| 0.6979166666666666 | -0.256 |
| 0.6986111111111111 | -0.256 |
| 0.6993055555555556 | -0.256 |
| 0.7000000000000001 | -0.256 |
| 0.7006944444444444 | -0.256 |
| 0.7013888888888888 | -0.256 |
| 0.7020833333333334 | -0.256 |
| 0.7027777777777778 | -0.256 |
| 0.7034722222222222 | -0.256 |
| 0.7041666666666666 | -0.256 |
| 0.7048611111111112 | -0.256 |
| 0.7055555555555556 | -0.256 |
| 0.7062499999999999 | -0.256 |
| 0.7069444444444444 | -0.256 |
| 0.7076388888888889 | -0.256 |
| 0.7083333333333334 | -0.256 |
| 0.7090277777777777 | -0.256 |
| 0.7097222222222223 | -0.256 |
| 0.7104166666666667 | -0.256 |
| 0.7111111111111111 | -0.256 |
| 0.7118055555555555 | -0.256 |
| 0.7125 | -0.256 |
| 0.7131944444444445 | -0.256 |
| 0.7138888888888889 | -0.256 |
| 0.7145833333333332 | -0.256 |
| 0.7152777777777778 | -0.256 |
| 0.7159722222222222 | -0.256 |
| 0.7166666666666667 | -0.256 |
| 0.717361111111111 | -0.256 |
| 0.7180555555555556 | -0.256 |
| 0.71875 | -0.256 |
| 0.7194444444444444 | -0.256 |
| 0.720138888888889 | -0.256 |
| 0.7208333333333333 | -0.256 |
| 0.7215277777777778 | -0.256 |
| 0.7222222222222222 | -0.256 |
| 0.7229166666666668 | -0.256 |
| 0.7236111111111111 | -0.256 |
| 0.7243055555555555 | -0.256 |
| 0.725 | -0.256 |
| 0.7256944444444445 | -0.256 |
| 0.7263888888888889 | -0.256 |
| 0.7270833333333333 | -0.256 |
| 0.7277777777777777 | -0.256 |
| 0.7284722222222223 | -0.256 |
| 0.7291666666666666 | -0.256 |
| 0.7298611111111111 | -0.256 |
| 0.7305555555555556 | -0.256 |
| 0.7312500000000001 | -0.256 |
| 0.7319444444444444 | -0.256 |
| 0.7326388888888888 | -0.256 |
| 0.7333333333333334 | -0.256 |
| 0.7340277777777778 | -0.256 |
| 0.7347222222222222 | -0.256 |
| 0.7354166666666666 | -0.256 |
| 0.7361111111111112 | -0.256 |
| 0.7368055555555556 | -0.256 |
| 0.7374999999999999 | -0.256 |
| 0.7381944444444444 | -0.256 |
| 0.7388888888888889 | -0.256 |
| 0.7395833333333334 | -0.256 |
| 0.7402777777777777 | -0.256 |
| 0.7409722222222223 | -0.256 |
| 0.7416666666666667 | -0.256 |
| 0.7423611111111111 | -0.256 |
| 0.7430555555555555 | -0.256 |
| 0.74375 | -0.256 |
| 0.7444444444444445 | -0.256 |
| 0.7451388888888889 | -0.256 |
| 0.7458333333333332 | -0.256 |
| 0.7465277777777778 | -0.256 |
| 0.7472222222222222 | -0.256 |
| 0.7479166666666667 | -0.256 |
| 0.748611111111111 | -0.256 |
| 0.7493055555555556 | -0.256 |
| 0.75 | -0.256 |
| 0.7506944444444444 | -0.256 |
| 0.751388888888889 | -0.256 |
| 0.7520833333333333 | -0.256 |
| 0.7527777777777778 | -0.256 |
| 0.7534722222222222 | -0.256 |
| 0.7541666666666668 | -0.256 |
| 0.7548611111111111 | -0.256 |
| 0.7555555555555555 | -0.256 |
| 0.75625 | -0.256 |
| 0.7569444444444445 | -0.256 |
| 0.7576388888888889 | -0.256 |
| 0.7583333333333333 | -0.256 |
| 0.7590277777777777 | -0.256 |
| 0.7597222222222223 | -0.256 |
| 0.7604166666666666 | -0.256 |
| 0.7611111111111111 | -0.256 |
| 0.7618055555555556 | -0.256 |
| 0.7625000000000001 | -0.256 |
| 0.7631944444444444 | -0.256 |
| 0.7638888888888888 | -0.256 |
| 0.7645833333333334 | -0.256 |
| 0.7652777777777778 | -0.256 |
| 0.7659722222222222 | -0.256 |
| 0.7666666666666666 | -0.256 |
| 0.7673611111111112 | -0.256 |
| 0.7680555555555556 | -0.256 |
| 0.7687499999999999 | -0.256 |
| 0.7694444444444444 | -0.256 |
| 0.7701388888888889 | -0.256 |
| 0.7708333333333334 | -0.256 |
| 0.7715277777777777 | -0.256 |
| 0.7722222222222223 | -0.256 |
| 0.7729166666666667 | -0.256 |
| 0.7736111111111111 | -0.256 |
| 0.7743055555555555 | -0.256 |
| 0.775 | -0.256 |
| 0.7756944444444445 | -0.256 |
| 0.7763888888888889 | -0.256 |
| 0.7770833333333332 | -0.256 |
| 0.7777777777777778 | -0.256 |
| 0.7784722222222222 | -0.256 |
| 0.7791666666666667 | -0.256 |
| 0.779861111111111 | -0.256 |
| 0.7805555555555556 | -0.256 |
| 0.78125 | -0.256 |
| 0.7819444444444444 | -0.256 |
| 0.782638888888889 | -0.256 |
| 0.7833333333333333 | -0.256 |
| 0.7840277777777778 | -0.256 |
| 0.7847222222222222 | -0.256 |
| 0.7854166666666668 | -0.256 |
| 0.7861111111111111 | -0.256 |
| 0.7868055555555555 | -0.256 |
| 0.7875 | -0.256 |
| 0.7881944444444445 | -0.256 |
| 0.7888888888888889 | -0.256 |
| 0.7895833333333333 | -0.256 |
| 0.7902777777777777 | -0.256 |
| 0.7909722222222223 | -0.256 |
| 0.7916666666666666 | -0.256 |
| 0.7923611111111111 | -0.256 |
| 0.7930555555555556 | -0.256 |
| 0.7937500000000001 | -0.256 |
| 0.7944444444444444 | -0.256 |
| 0.7951388888888888 | -0.256 |
| 0.7958333333333334 | -0.256 |
| 0.7965277777777778 | -0.256 |
| 0.7972222222222222 | -0.256 |
| 0.7979166666666666 | -0.256 |
| 0.7986111111111112 | -0.256 |
| 0.7993055555555556 | -0.256 |
| 0.7999999999999999 | -0.256 |
| 0.8006944444444444 | -0.256 |
| 0.8013888888888889 | -0.256 |
| 0.8020833333333334 | -0.256 |
| 0.8027777777777777 | -0.256 |
| 0.8034722222222223 | -0.256 |
| 0.8041666666666667 | -0.256 |
| 0.8048611111111111 | -0.256 |
| 0.8055555555555555 | -0.256 |
| 0.80625 | -0.256 |
| 0.8069444444444445 | -0.256 |
| 0.8076388888888889 | -0.256 |
| 0.8083333333333332 | -0.256 |
| 0.8090277777777778 | -0.256 |
| 0.8097222222222222 | -0.256 |
| 0.8104166666666667 | -0.256 |
| 0.811111111111111 | -0.256 |
| 0.8118055555555556 | -0.256 |
| 0.8125 | -0.256 |
| 0.8131944444444444 | -0.256 |
| 0.813888888888889 | -0.256 |
| 0.8145833333333333 | -0.256 |
| 0.8152777777777778 | -0.256 |
| 0.8159722222222222 | -0.256 |
| 0.8166666666666668 | -0.256 |
| 0.8173611111111111 | -0.256 |
| 0.8180555555555555 | -0.256 |
| 0.81875 | -0.256 |
| 0.8194444444444445 | -0.256 |
| 0.8201388888888889 | -0.256 |
| 0.8208333333333333 | -0.256 |
| 0.8215277777777777 | -0.256 |
| 0.8222222222222223 | -0.256 |
| 0.8229166666666666 | -0.256 |
| 0.8236111111111111 | -0.256 |
| 0.8243055555555556 | -0.256 |
| 0.8250000000000001 | -0.256 |
| 0.8256944444444444 | -0.256 |
| 0.8263888888888888 | -0.256 |
| 0.8270833333333334 | -0.256 |
| 0.8277777777777778 | -0.256 |
| 0.8284722222222222 | -0.256 |
| 0.8291666666666666 | -0.256 |
| 0.8298611111111112 | -0.256 |
| 0.8305555555555556 | -0.256 |
| 0.8312499999999999 | -0.256 |
| 0.8319444444444444 | -0.256 |
| 0.8326388888888889 | -0.256 |
| 0.8333333333333334 | -0.256 |
| 0.8340277777777777 | -0.256 |
| 0.8347222222222223 | -0.256 |
| 0.8354166666666667 | -0.256 |
| 0.8361111111111111 | -0.256 |
| 0.8368055555555555 | -0.256 |
| 0.8375 | -0.256 |
| 0.8381944444444445 | -0.256 |
| 0.8388888888888889 | -0.256 |
| 0.8395833333333332 | -0.256 |
| 0.8402777777777778 | -0.256 |
| 0.8409722222222222 | -0.256 |
| 0.8416666666666667 | -0.256 |
| 0.842361111111111 | -0.256 |
| 0.8430555555555556 | -0.256 |
| 0.84375 | -0.256 |
| 0.8444444444444444 | -0.256 |
| 0.845138888888889 | -0.256 |
| 0.8458333333333333 | -0.256 |
| 0.8465277777777778 | -0.256 |
| 0.8472222222222222 | -0.256 |
| 0.8479166666666668 | -0.256 |
| 0.8486111111111111 | -0.256 |
| 0.8493055555555555 | -0.256 |
| 0.85 | -0.256 |
| 0.8506944444444445 | -0.256 |
| 0.8513888888888889 | -0.256 |
| 0.8520833333333333 | -0.256 |
| 0.8527777777777777 | -0.256 |
| 0.8534722222222223 | -0.256 |
| 0.8541666666666666 | -0.256 |
| 0.8548611111111111 | -0.256 |
| 0.8555555555555556 | -0.256 |
| 0.8562500000000001 | -0.256 |
| 0.8569444444444444 | -0.256 |
| 0.8576388888888888 | -0.256 |
| 0.8583333333333334 | -0.256 |
| 0.8590277777777778 | -0.256 |
| 0.8597222222222222 | -0.256 |
| 0.8604166666666666 | -0.256 |
| 0.8611111111111112 | -0.256 |
| 0.8618055555555556 | -0.256 |
| 0.8624999999999999 | -0.256 |
| 0.8631944444444444 | -0.256 |
| 0.8638888888888889 | -0.256 |
| 0.8645833333333334 | -0.256 |
| 0.8652777777777777 | -0.256 |
| 0.8659722222222223 | -0.256 |
| 0.8666666666666667 | -0.256 |
| 0.8673611111111111 | -0.256 |
| 0.8680555555555555 | -0.256 |
| 0.86875 | -0.256 |
| 0.8694444444444445 | -0.256 |
| 0.8701388888888889 | -0.256 |
| 0.8708333333333332 | -0.256 |
| 0.8715277777777778 | -0.256 |
| 0.8722222222222222 | -0.256 |
| 0.8729166666666667 | -0.256 |
| 0.873611111111111 | -0.256 |
| 0.8743055555555556 | -0.256 |
| 0.875 | -0.256 |
| 0.8756944444444444 | -0.256 |
| 0.876388888888889 | -0.256 |
| 0.8770833333333333 | -0.256 |
| 0.8777777777777778 | -0.256 |
| 0.8784722222222222 | -0.256 |
| 0.8791666666666668 | -0.256 |
| 0.8798611111111111 | -0.256 |
| 0.8805555555555555 | -0.256 |
| 0.88125 | -0.256 |
| 0.8819444444444445 | -0.256 |
| 0.8826388888888889 | -0.256 |
| 0.8833333333333333 | -0.256 |
| 0.8840277777777777 | -0.256 |
| 0.8847222222222223 | -0.256 |
| 0.8854166666666666 | -0.256 |
| 0.8861111111111111 | -0.256 |
| 0.8868055555555556 | -0.256 |
| 0.8875000000000001 | -0.256 |
| 0.8881944444444444 | -0.256 |
| 0.8888888888888888 | -0.256 |
| 0.8895833333333334 | -0.256 |
| 0.8902777777777778 | -0.256 |
| 0.8909722222222222 | -0.256 |
| 0.8916666666666666 | -0.256 |
| 0.8923611111111112 | -0.256 |
| 0.8930555555555556 | -0.256 |
| 0.8937499999999999 | -0.256 |
| 0.8944444444444444 | -0.256 |
| 0.8951388888888889 | -0.256 |
| 0.8958333333333334 | -0.256 |
| 0.8965277777777777 | -0.256 |
| 0.8972222222222223 | -0.256 |
| 0.8979166666666667 | -0.256 |
| 0.8986111111111111 | -0.256 |
| 0.8993055555555555 | -0.256 |
| 0.9 | -0.256 |
| 0.9006944444444445 | -0.256 |
| 0.9013888888888889 | -0.256 |
| 0.9020833333333332 | -0.256 |
| 0.9027777777777778 | -0.256 |
| 0.9034722222222222 | -0.256 |
| 0.9041666666666667 | -0.256 |
| 0.904861111111111 | -0.256 |
| 0.9055555555555556 | -0.256 |
| 0.90625 | -0.256 |
| 0.9069444444444444 | -0.256 |
| 0.907638888888889 | -0.256 |
| 0.9083333333333333 | -0.256 |
| 0.9090277777777778 | -0.256 |
| 0.9097222222222222 | -0.256 |
| 0.9104166666666668 | -0.256 |
| 0.9111111111111111 | -0.256 |
| 0.9118055555555555 | -0.256 |
| 0.9125 | -0.256 |
| 0.9131944444444445 | -0.256 |
| 0.9138888888888889 | -0.256 |
| 0.9145833333333333 | -0.256 |
| 0.9152777777777777 | -0.256 |
| 0.9159722222222223 | -0.256 |
| 0.9166666666666666 | -0.256 |
| 0.9173611111111111 | -0.256 |
| 0.9180555555555556 | -0.256 |
| 0.9187500000000001 | -0.256 |
| 0.9194444444444444 | -0.256 |
| 0.9201388888888888 | -0.256 |
| 0.9208333333333334 | -0.256 |
| 0.9215277777777778 | -0.256 |
| 0.9222222222222222 | -0.256 |
| 0.9229166666666666 | -0.256 |
| 0.9236111111111112 | -0.256 |
| 0.9243055555555556 | -0.256 |
| 0.9249999999999999 | -0.256 |
| 0.9256944444444444 | -0.256 |
| 0.9263888888888889 | -0.256 |
| 0.9270833333333334 | -0.256 |
| 0.9277777777777777 | -0.256 |
| 0.9284722222222223 | -0.256 |
| 0.9291666666666667 | -0.256 |
| 0.9298611111111111 | -0.256 |
| 0.9305555555555555 | -0.256 |
| 0.93125 | -0.256 |
| 0.9319444444444445 | -0.256 |
| 0.9326388888888889 | -0.256 |
| 0.9333333333333332 | -0.256 |
| 0.9340277777777778 | -0.256 |
| 0.9347222222222222 | -0.256 |
| 0.9354166666666667 | -0.256 |
| 0.936111111111111 | -0.256 |
| 0.9368055555555556 | -0.256 |
| 0.9375 | -0.256 |
| 0.9381944444444444 | -0.256 |
| 0.938888888888889 | -0.256 |
| 0.9395833333333333 | -0.256 |
| 0.9402777777777778 | -0.256 |
| 0.9409722222222222 | -0.256 |
| 0.9416666666666668 | -0.256 |
| 0.9423611111111111 | -0.256 |
| 0.9430555555555555 | -0.256 |
| 0.94375 | -0.256 |
| 0.9444444444444445 | -0.256 |
| 0.9451388888888889 | -0.256 |
| 0.9458333333333333 | -0.256 |
| 0.9465277777777777 | -0.256 |
| 0.9472222222222223 | -0.256 |
| 0.9479166666666666 | -0.256 |
| 0.9486111111111111 | -0.256 |
| 0.9493055555555556 | -0.256 |
| 0.9500000000000001 | -0.256 |
| 0.9506944444444444 | -0.256 |
| 0.9513888888888888 | -0.256 |
| 0.9520833333333334 | -0.256 |
| 0.9527777777777778 | -0.256 |
| 0.9534722222222222 | -0.256 |
| 0.9541666666666666 | -0.256 |
| 0.9548611111111112 | -0.256 |
| 0.9555555555555556 | -0.256 |
| 0.9562499999999999 | -0.256 |
| 0.9569444444444444 | -0.256 |
| 0.9576388888888889 | -0.256 |
| 0.9583333333333334 | -0.256 |
| 0.9590277777777777 | -0.256 |
| 0.9597222222222223 | -0.256 |
| 0.9604166666666667 | -0.256 |
| 0.9611111111111111 | -0.256 |
| 0.9618055555555555 | -0.256 |
| 0.9625 | -0.256 |
| 0.9631944444444445 | -0.256 |
| 0.9638888888888889 | -0.256 |
| 0.9645833333333332 | -0.256 |
| 0.9652777777777778 | -0.256 |
| 0.9659722222222222 | -0.256 |
| 0.9666666666666667 | -0.256 |
| 0.967361111111111 | -0.256 |
| 0.9680555555555556 | -0.256 |
| 0.96875 | -0.256 |
| 0.9694444444444444 | -0.256 |
| 0.970138888888889 | -0.256 |
| 0.9708333333333333 | -0.256 |
| 0.9715277777777778 | -0.256 |
| 0.9722222222222222 | -0.256 |
| 0.9729166666666668 | -0.256 |
| 0.9736111111111111 | -0.256 |
| 0.9743055555555555 | -0.256 |
| 0.975 | -0.256 |
| 0.9756944444444445 | -0.256 |
| 0.9763888888888889 | -0.256 |
| 0.9770833333333333 | -0.256 |
| 0.9777777777777777 | -0.256 |
| 0.9784722222222223 | -0.256 |
| 0.9791666666666666 | -0.256 |
| 0.9798611111111111 | -0.256 |
| 0.9805555555555556 | -0.256 |
| 0.9812500000000001 | -0.256 |
| 0.9819444444444444 | -0.256 |
| 0.9826388888888888 | -0.256 |
| 0.9833333333333334 | -0.256 |
| 0.9840277777777778 | -0.256 |
| 0.9847222222222222 | -0.256 |
| 0.9854166666666666 | -0.256 |
| 0.9861111111111112 | -0.256 |
| 0.9868055555555556 | -0.256 |
| 0.9874999999999999 | -0.256 |
| 0.9881944444444444 | -0.256 |
| 0.9888888888888889 | -0.256 |
| 0.9895833333333334 | -0.256 |
| 0.9902777777777777 | -0.256 |
| 0.9909722222222223 | -0.256 |
| 0.9916666666666667 | -0.256 |
| 0.9923611111111111 | -0.256 |
| 0.9930555555555555 | -0.256 |
| 0.99375 | -0.256 |
| 0.9944444444444445 | -0.256 |
| 0.9951388888888889 | -0.256 |
| 0.9958333333333332 | -0.256 |
| 0.9965277777777778 | -0.256 |
| 0.9972222222222222 | -0.256 |
| 0.9979166666666667 | -0.256 |
| 0.998611111111111 | -0.256 |
| 0.9993055555555556 | 0 |